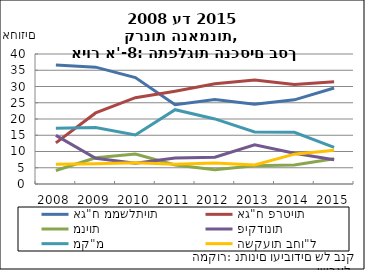
| Category | אג"ח ממשלתיות | אג"ח פרטיות | מניות | פיקדונות  | מק"מ | השקעות בחו"ל |
|---|---|---|---|---|---|---|
| 2008-12-31 | 36.628 | 12.643 | 4.159 | 14.953 | 17.118 | 6.065 |
| 2009-12-31 | 35.958 | 21.866 | 8.065 | 7.93 | 17.397 | 6.236 |
| 2010-12-31 | 32.76 | 26.552 | 9.232 | 6.418 | 15.079 | 6.551 |
| 2011-12-31 | 24.425 | 28.561 | 5.872 | 7.997 | 22.871 | 6.096 |
| 2012-12-31 | 26.016 | 30.814 | 4.376 | 8.229 | 20.024 | 6.486 |
| 2013-12-31 | 24.544 | 31.971 | 5.604 | 12.088 | 16.021 | 5.882 |
| 2014-12-31 | 25.889 | 30.646 | 5.822 | 9.491 | 15.888 | 9.179 |
| 2015-12-31 | 29.523 | 31.444 | 7.775 | 7.43 | 11.293 | 10.409 |